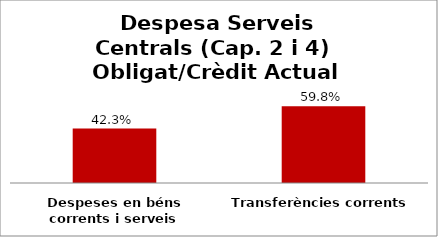
| Category | Series 0 |
|---|---|
| Despeses en béns corrents i serveis | 0.423 |
| Transferències corrents | 0.598 |